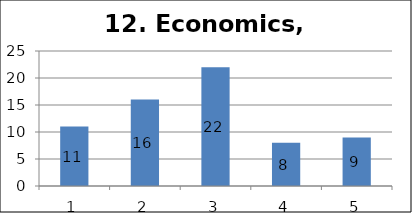
| Category | Series 1 |
|---|---|
| 0 | 11 |
| 1 | 16 |
| 2 | 22 |
| 3 | 8 |
| 4 | 9 |